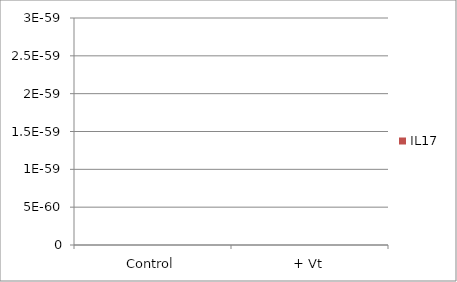
| Category | IL17 |
|---|---|
| Control | 0 |
| + Vt | 0 |